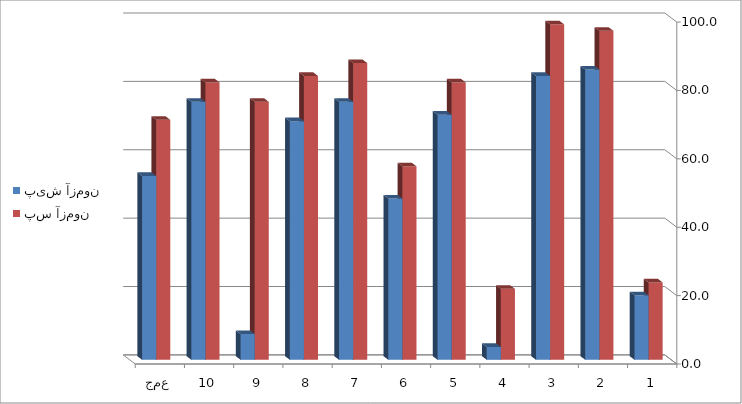
| Category | پیش آزمون | پس آزمون |
|---|---|---|
| 1 | 18.868 | 22.642 |
| 2 | 84.906 | 96.226 |
| 3 | 83.019 | 98.113 |
| 4 | 3.774 | 20.755 |
| 5 | 71.698 | 81.132 |
| 6 | 47.17 | 56.604 |
| 7 | 75.472 | 86.792 |
| 8 | 69.811 | 83.019 |
| 9 | 7.547 | 75.472 |
| 10 | 75.472 | 81.132 |
| جمع | 53.774 | 70.189 |